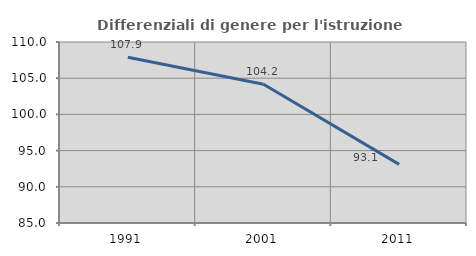
| Category | Differenziali di genere per l'istruzione superiore |
|---|---|
| 1991.0 | 107.903 |
| 2001.0 | 104.171 |
| 2011.0 | 93.1 |